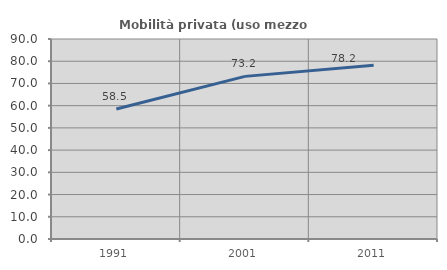
| Category | Mobilità privata (uso mezzo privato) |
|---|---|
| 1991.0 | 58.53 |
| 2001.0 | 73.181 |
| 2011.0 | 78.152 |